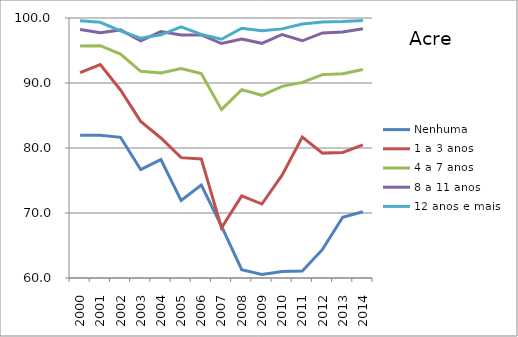
| Category | Nenhuma | 1 a 3 anos | 4 a 7 anos | 8 a 11 anos | 12 anos e mais |
|---|---|---|---|---|---|
| 2000.0 | 81.964 | 91.612 | 95.681 | 98.231 | 99.593 |
| 2001.0 | 81.952 | 92.827 | 95.746 | 97.734 | 99.339 |
| 2002.0 | 81.646 | 88.923 | 94.458 | 98.166 | 98.006 |
| 2003.0 | 76.681 | 84.096 | 91.791 | 96.487 | 96.9 |
| 2004.0 | 78.214 | 81.54 | 91.543 | 97.911 | 97.417 |
| 2005.0 | 71.919 | 78.517 | 92.219 | 97.37 | 98.639 |
| 2006.0 | 74.311 | 78.323 | 91.441 | 97.395 | 97.48 |
| 2007.0 | 67.99 | 67.715 | 85.899 | 96.073 | 96.737 |
| 2008.0 | 61.287 | 72.641 | 88.983 | 96.748 | 98.428 |
| 2009.0 | 60.537 | 71.381 | 88.107 | 96.104 | 98.054 |
| 2010.0 | 60.996 | 75.827 | 89.481 | 97.462 | 98.325 |
| 2011.0 | 61.076 | 81.697 | 90.1 | 96.495 | 99.074 |
| 2012.0 | 64.4 | 79.213 | 91.289 | 97.698 | 99.366 |
| 2013.0 | 69.355 | 79.321 | 91.433 | 97.843 | 99.446 |
| 2014.0 | 70.184 | 80.493 | 92.089 | 98.33 | 99.63 |